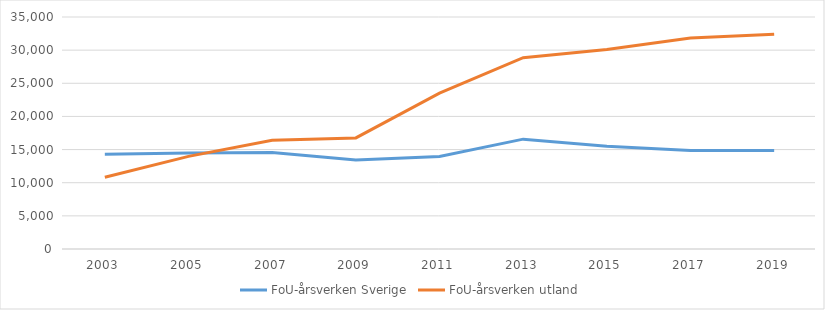
| Category | FoU-årsverken Sverige | FoU-årsverken utland |
|---|---|---|
| 2003.0 | 14312 | 10815 |
| 2005.0 | 14480 | 13976.15 |
| 2007.0 | 14574.5 | 16411.8 |
| 2009.0 | 13418 | 16754 |
| 2011.0 | 13964 | 23526 |
| 2013.0 | 16573 | 28869 |
| 2015.0 | 15502 | 30090 |
| 2017.0 | 14877 | 31831 |
| 2019.0 | 14865 | 32409 |